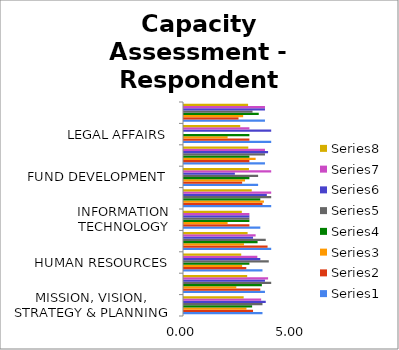
| Category | Series 0 | Series 1 | Series 2 | Series 3 | Series 4 | Series 5 | Series 6 | Series 7 |
|---|---|---|---|---|---|---|---|---|
| MISSION, VISION, STRATEGY & PLANNING | 3.6 | 3.167 | 2.867 | 3.125 | 3.6 | 3.75 | 3.538 | 2.737 |
| PROGRAM DESIGN & EVALUATION | 3.714 | 3.5 | 2.4 | 3.571 | 4 | 3.714 | 3.857 | 2.899 |
| HUMAN RESOURCES | 3.6 | 2.857 | 2.667 | 3 | 3.889 | 3.5 | 3.364 | 2.625 |
| CEO/ED/SENIOR MANAGEMENT TEAM LEADERSHIP | 4 | 3.833 | 2.75 | 3.375 | 3.75 | 3.167 | 3.286 | 2.917 |
| INFORMATION TECHNOLOGY | 3.5 | 3 | 2 | 3 | 3 | 3 | 3 | 2.652 |
| FINANCIAL MANAGEMENT | 4 | 3.6 | 3.667 | 3.5 | 4 | 3.8 | 4 | 3.107 |
| FUND DEVELOPMENT | 3.4 | 2.667 | 2.8 | 3 | 3.4 | 2.333 | 4 | 2.98 |
| BOARD LEADERSHIP | 3.714 | 3 | 3.286 | 3 | 3.714 | 3.857 | 3.714 | 2.95 |
| LEGAL AFFAIRS | 4 | 3 | 2 | 3 | 0 | 4 | 3 | 2.579 |
| MARKETING, COMMUNICATIONS, & EXTERNAL RELATIONS | 3.714 | 2.5 | 2.714 | 3.429 | 3.143 | 3.714 | 3.714 | 2.94 |